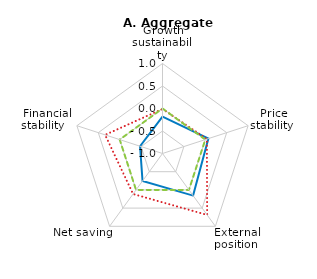
| Category | 2016Q3 (or latest data available) | 2007 | Long-term average |
|---|---|---|---|
| Growth sustainability | -0.18 | -0.011 | 0 |
| Price
stability  | 0.072 | 0.037 | 0 |
| External
position  | 0.157 | 0.688 | 0 |
| Net saving | -0.245 | 0.113 | 0 |
| Financial
stability    | -0.476 | 0.341 | 0 |